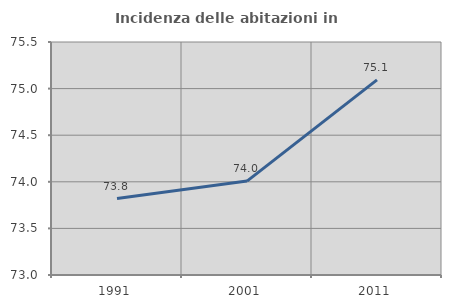
| Category | Incidenza delle abitazioni in proprietà  |
|---|---|
| 1991.0 | 73.821 |
| 2001.0 | 74.008 |
| 2011.0 | 75.094 |